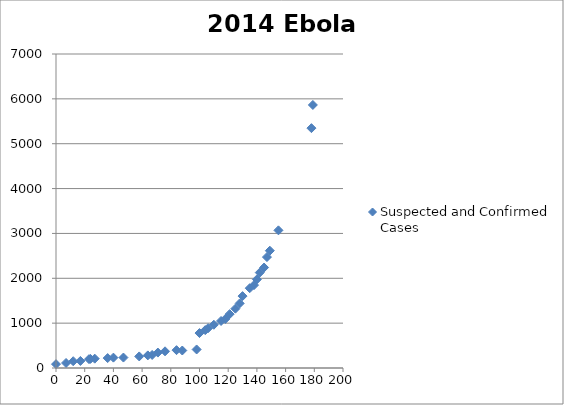
| Category | Suspected and Confirmed Cases |
|---|---|
| 0.0 | 86 |
| 7.0 | 112 |
| 12.0 | 151 |
| 17.0 | 157 |
| 23.0 | 197 |
| 24.0 | 203 |
| 27.0 | 208 |
| 36.0 | 221 |
| 40.0 | 231 |
| 47.0 | 233 |
| 58.0 | 258 |
| 64.0 | 281 |
| 67.0 | 291 |
| 71.0 | 344 |
| 76.0 | 372 |
| 84.0 | 398 |
| 88.0 | 390 |
| 98.0 | 413 |
| 100.0 | 779 |
| 104.0 | 844 |
| 106.0 | 888 |
| 110.0 | 964 |
| 115.0 | 1048 |
| 118.0 | 1093 |
| 121.0 | 1201 |
| 125.0 | 1323 |
| 128.0 | 1440 |
| 130.0 | 1603 |
| 135.0 | 1779 |
| 138.0 | 1848 |
| 140.0 | 1975 |
| 142.0 | 2127 |
| 145.0 | 2240 |
| 147.0 | 2473 |
| 149.0 | 2615 |
| 155.0 | 3069 |
| 178.0 | 5347 |
| 179.0 | 5864 |